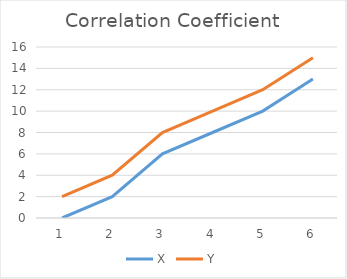
| Category | X | Y |
|---|---|---|
| 0 | 0 | 2 |
| 1 | 2 | 4 |
| 2 | 6 | 8 |
| 3 | 8 | 10 |
| 4 | 10 | 12 |
| 5 | 13 | 15 |